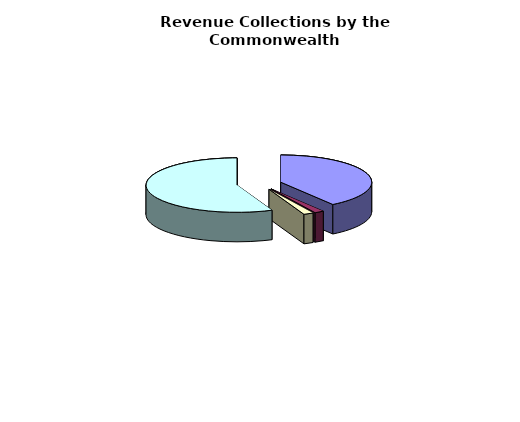
| Category | Series 0 |
|---|---|
| General Fund | 19188948000 |
| Non-General Fund | 800144000 |
| General Fund | 835072000 |
| Non-General Fund | 26808662000 |